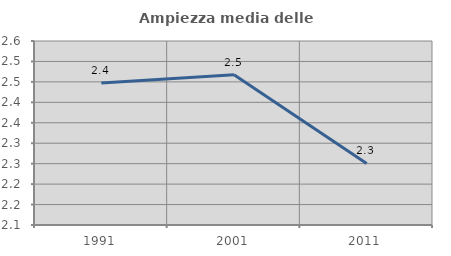
| Category | Ampiezza media delle famiglie |
|---|---|
| 1991.0 | 2.447 |
| 2001.0 | 2.467 |
| 2011.0 | 2.251 |